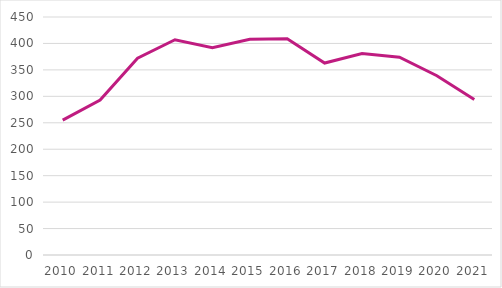
| Category | Antal anmeldte opfindelser på universiteterne |
|---|---|
| 2010.0 | 255 |
| 2011.0 | 293 |
| 2012.0 | 372 |
| 2013.0 | 407 |
| 2014.0 | 392 |
| 2015.0 | 408 |
| 2016.0 | 409 |
| 2017.0 | 363 |
| 2018.0 | 381 |
| 2019.0 | 374 |
| 2020.0 | 339 |
| 2021.0 | 294 |